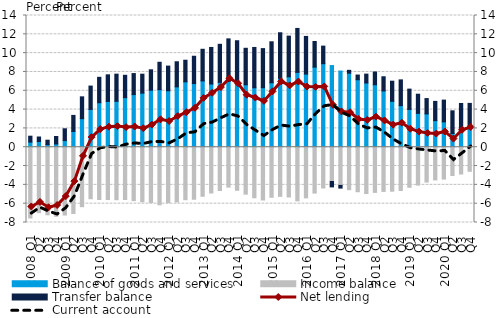
| Category | Balance of goods and services | Income balance | Transfer balance |
|---|---|---|---|
| 2008 Q1 | 0.542 | -7.522 | 0.63 |
| Q2 | 0.61 | -6.953 | 0.477 |
| Q3 | 0.274 | -7.18 | 0.474 |
| Q4 | 0.347 | -7.339 | 0.794 |
| 2009 Q1 | 0.707 | -7.208 | 1.254 |
| Q2 | 1.678 | -7.037 | 1.705 |
| Q3 | 3.033 | -6.321 | 2.323 |
| Q4 | 4.018 | -5.474 | 2.481 |
| 2010 Q1 | 4.729 | -5.554 | 2.702 |
| Q2 | 4.866 | -5.56 | 2.828 |
| Q3 | 4.881 | -5.577 | 2.885 |
| Q4 | 5.27 | -5.556 | 2.375 |
| 2011 Q1 | 5.594 | -5.676 | 2.234 |
| Q2 | 5.748 | -5.797 | 2.014 |
| Q3 | 6.061 | -5.88 | 2.169 |
| Q4 | 6.121 | -6.116 | 2.908 |
| 2012 Q1 | 5.999 | -5.893 | 2.625 |
| Q2 | 6.415 | -5.818 | 2.668 |
| Q3 | 6.95 | -5.577 | 2.297 |
| Q4 | 6.767 | -5.529 | 2.903 |
| 2013 Q1 | 7.049 | -5.213 | 3.36 |
| Q2 | 6.717 | -4.866 | 3.887 |
| Q3 | 6.896 | -4.599 | 4.042 |
| Q4 | 6.986 | -4.238 | 4.531 |
| 2014 Q1 | 7.05 | -4.575 | 4.268 |
| Q2 | 6.636 | -4.987 | 3.879 |
| Q3 | 6.32 | -5.375 | 4.284 |
| Q4 | 6.328 | -5.609 | 4.153 |
| 2015 Q1 | 6.85 | -5.318 | 4.357 |
| Q2 | 7.318 | -5.223 | 4.849 |
| Q3 | 7.485 | -5.289 | 4.324 |
| Q4 | 7.95 | -5.698 | 4.676 |
| 2016 Q1 | 7.771 | -5.382 | 4.006 |
| Q2 | 8.512 | -4.875 | 2.726 |
| Q3 | 8.877 | -4.333 | 1.868 |
| Q4 | 8.682 | -3.645 | -0.57 |
| 2017 Q1 | 8.098 | -4.058 | -0.284 |
| Q2 | 7.87 | -4.512 | 0.304 |
| Q3 | 7.17 | -4.73 | 0.503 |
| Q4 | 6.827 | -4.922 | 0.942 |
| 2018 Q1 | 6.639 | -4.799 | 1.359 |
| Q2 | 5.982 | -4.697 | 1.508 |
| Q3 | 4.878 | -4.673 | 2.141 |
| Q4 | 4.42 | -4.601 | 2.736 |
| 2019 Q1 | 4.019 | -4.262 | 2.157 |
| Q2 | 3.596 | -4.022 | 2.039 |
| Q3 | 3.54 | -3.705 | 1.63 |
| Q4 | 2.828 | -3.475 | 2.045 |
| 2020 Q1 | 2.696 | -3.387 | 2.312 |
| Q2 | 1.449 | -3.002 | 2.419 |
| Q3 | 1.748 | -2.847 | 2.904 |
| Q4 | 2.29 | -2.557 | 2.369 |